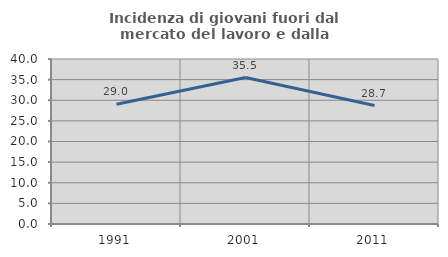
| Category | Incidenza di giovani fuori dal mercato del lavoro e dalla formazione  |
|---|---|
| 1991.0 | 29.047 |
| 2001.0 | 35.501 |
| 2011.0 | 28.708 |